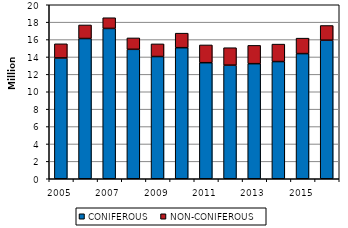
| Category | CONIFEROUS | NON-CONIFEROUS |
|---|---|---|
| 2005.0 | 13883297 | 1627249 |
| 2006.0 | 16117868 | 1560400 |
| 2007.0 | 17278165 | 1230129 |
| 2008.0 | 14877230 | 1310065 |
| 2009.0 | 14046973 | 1455346 |
| 2010.0 | 15066146 | 1670128 |
| 2011.0 | 13340375 | 2040843 |
| 2012.0 | 13055720 | 2005410 |
| 2013.0 | 13228512 | 2102268 |
| 2014.0 | 13471533 | 2004426 |
| 2015.0 | 14384593 | 1778052 |
| 2016.0 | 15923807 | 1692746 |